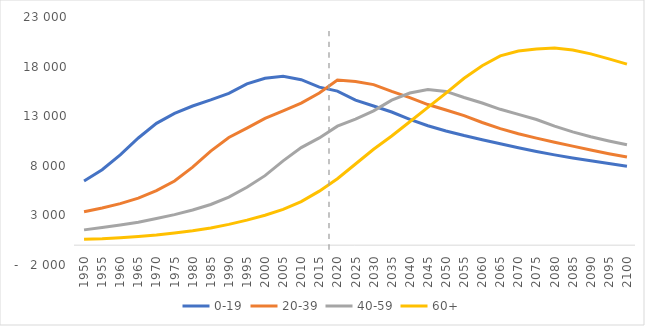
| Category | 0-19 | 20-39 | 40-59 | 60+ |
|---|---|---|---|---|
| 1950.0 | 6476 | 3359 | 1540 | 604 |
| 1955.0 | 7599 | 3742 | 1783 | 651 |
| 1960.0 | 9095 | 4190 | 2030 | 742 |
| 1965.0 | 10802 | 4746 | 2314 | 864 |
| 1970.0 | 12279 | 5492 | 2686 | 1022 |
| 1975.0 | 13285 | 6471 | 3080 | 1230 |
| 1980.0 | 14028 | 7871 | 3551 | 1451 |
| 1985.0 | 14640 | 9479 | 4100 | 1730 |
| 1990.0 | 15310 | 10855 | 4844 | 2095 |
| 1995.0 | 16265 | 11792 | 5839 | 2526 |
| 2000.0 | 16831 | 12773 | 7007 | 3017 |
| 2005.0 | 17025 | 13527 | 8494 | 3602 |
| 2010.0 | 16683 | 14316 | 9839 | 4385 |
| 2015.0 | 15930 | 15330 | 10814 | 5448 |
| 2020.0 | 15533 | 16657 | 11995 | 6697 |
| 2025.0 | 14616 | 16499 | 12714 | 8178 |
| 2030.0 | 14024 | 16187 | 13537 | 9668 |
| 2035.0 | 13423 | 15496 | 14619 | 11011 |
| 2040.0 | 12684 | 14874 | 15334 | 12442 |
| 2045.0 | 12038 | 14174 | 15692 | 13894 |
| 2050.0 | 11513 | 13624 | 15498 | 15323 |
| 2055.0 | 11048 | 13065 | 14887 | 16820 |
| 2060.0 | 10626 | 12363 | 14332 | 18088 |
| 2065.0 | 10218 | 11744 | 13694 | 19076 |
| 2070.0 | 9816 | 11238 | 13187 | 19574 |
| 2075.0 | 9442 | 10788 | 12665 | 19780 |
| 2080.0 | 9101 | 10379 | 12000 | 19863 |
| 2085.0 | 8793 | 9982 | 11414 | 19680 |
| 2090.0 | 8507 | 9589 | 10934 | 19281 |
| 2095.0 | 8232 | 9223 | 10507 | 18778 |
| 2100.0 | 7964 | 8891 | 10118 | 18248 |